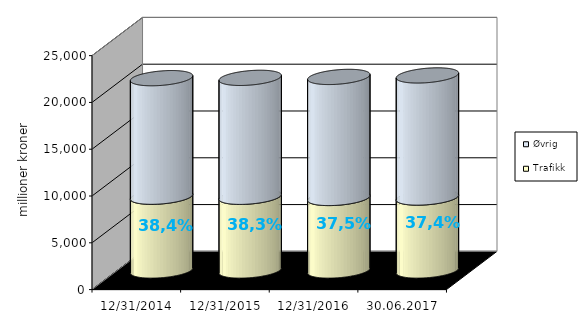
| Category | Trafikk | Øvrig |
|---|---|---|
| 31.12.2014 | 7884.668 | 12665.925 |
| 31.12.2015 | 7875.825 | 12707.863 |
| 31.12.2016 | 7750.819 | 12931.461 |
| 30.06.2017 | 7796.301 | 13046.202 |